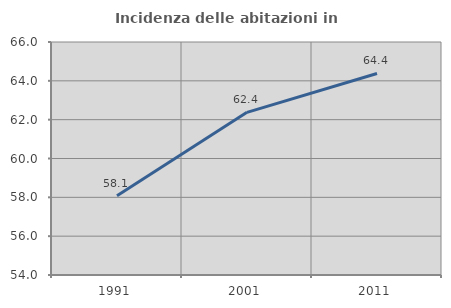
| Category | Incidenza delle abitazioni in proprietà  |
|---|---|
| 1991.0 | 58.081 |
| 2001.0 | 62.377 |
| 2011.0 | 64.378 |